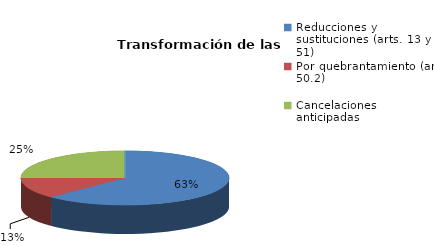
| Category | Series 0 |
|---|---|
| Reducciones y sustituciones (arts. 13 y 51) | 5 |
| Por quebrantamiento (art. 50.2) | 1 |
| Cancelaciones anticipadas | 2 |
| Traslado a Centros Penitenciarios | 0 |
| Conversión internamientos en cerrados (art. 51.2) | 0 |